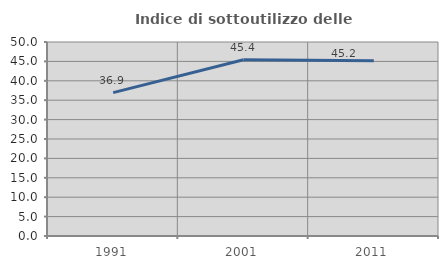
| Category | Indice di sottoutilizzo delle abitazioni  |
|---|---|
| 1991.0 | 36.942 |
| 2001.0 | 45.411 |
| 2011.0 | 45.154 |